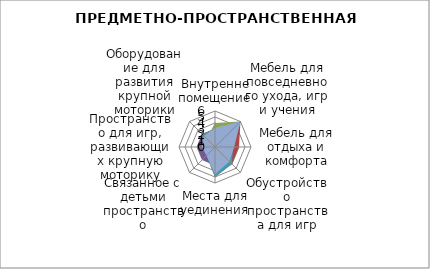
| Category | Series 0 | Series 1 | Series 2 | Series 3 | Series 4 | Series 5 | Series 6 |
|---|---|---|---|---|---|---|---|
| Внутренне помещение | 3 | 3 | 4 | 3 | 3 |  | 3.2 |
| Мебель для повседневного ухода, игр и учения | 6 | 6 | 6 | 6 | 6 |  | 6 |
| Мебель для отдыха и комфорта | 3 | 4 | 3 | 3 | 3 |  | 3.2 |
| Обустройство пространства для игр | 3 | 4 | 3 | 3 | 4 |  | 3.4 |
| Места для уединения | 5 | 5 | 5 | 3 | 5 |  | 4.6 |
| Связанное с детьми пространство | 1 | 2 | 2 | 3 | 2 |  | 2 |
| Пространство для игр, развивающих крупную моторику | 2 | 3 | 1 | 3 | 2 |  | 2.2 |
| Оборудование для развития крупной моторики | 2 | 3 | 2 | 3 | 3 |  | 2.6 |